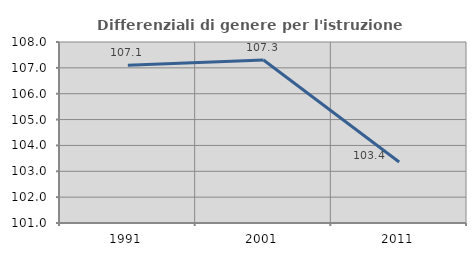
| Category | Differenziali di genere per l'istruzione superiore |
|---|---|
| 1991.0 | 107.099 |
| 2001.0 | 107.306 |
| 2011.0 | 103.357 |